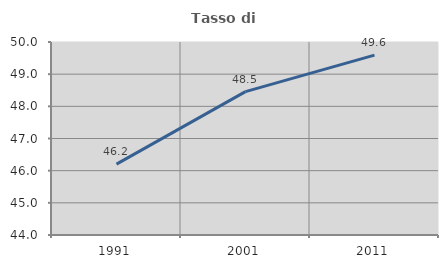
| Category | Tasso di occupazione   |
|---|---|
| 1991.0 | 46.203 |
| 2001.0 | 48.456 |
| 2011.0 | 49.59 |